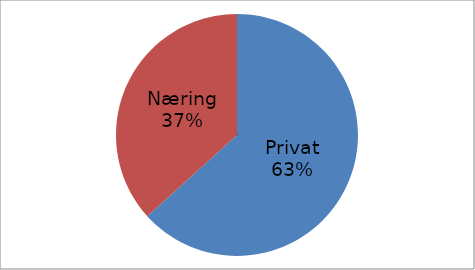
| Category | Series 0 |
|---|---|
| Privat | 35178205 |
| Næring | 20400895 |